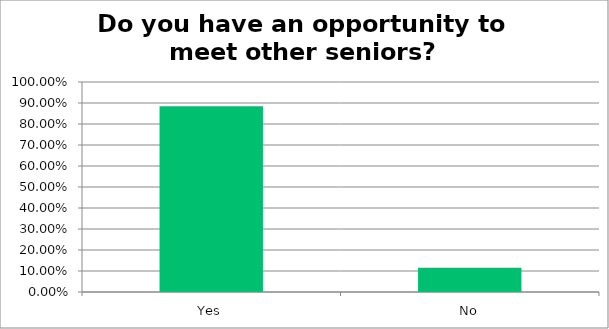
| Category | Responses |
|---|---|
| Yes | 0.885 |
| No | 0.115 |